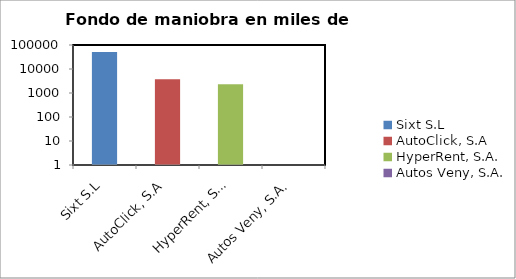
| Category | fondo de maniobra |
|---|---|
| Sixt S.L | 51297.784 |
| AutoClick, S.A | 3742.014 |
| HyperRent, S.A. | 2336.315 |
| Autos Veny, S.A. | -265.731 |